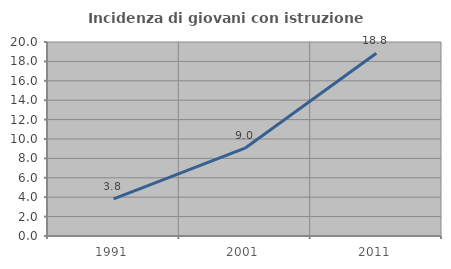
| Category | Incidenza di giovani con istruzione universitaria |
|---|---|
| 1991.0 | 3.834 |
| 2001.0 | 9.05 |
| 2011.0 | 18.836 |